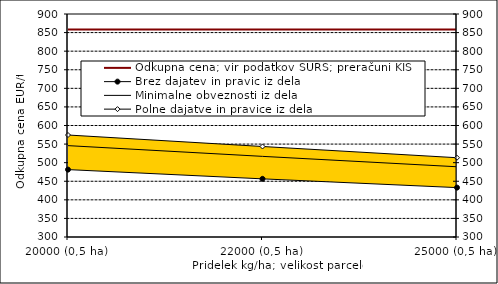
| Category | Odkupna cena; vir podatkov SURS; preračuni KIS |
|---|---|
| 20000 (0,5 ha) | 858.6 |
| 22000 (0,5 ha) | 858.6 |
| 25000 (0,5 ha) | 858.6 |